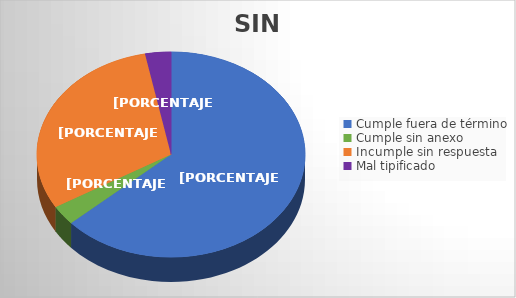
| Category | TOTAL |
|---|---|
| Cumple fuera de término | 102 |
| Cumple sin anexo | 5 |
| Incumple sin respuesta | 49 |
| Mal tipificado | 5 |